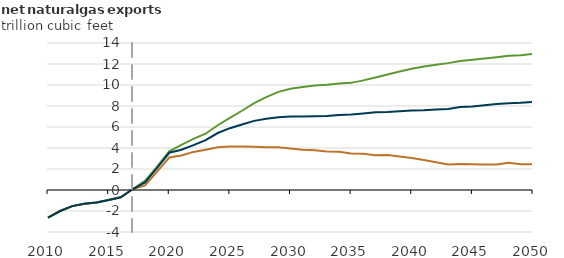
| Category | High oil and gas resource and technology | Low oil and gas resource and technology | Reference |
|---|---|---|---|
| 2010.0 | -2.635 | -2.635 | -2.635 |
| 2011.0 | -2.003 | -2.003 | -2.003 |
| 2012.0 | -1.534 | -1.534 | -1.534 |
| 2013.0 | -1.314 | -1.314 | -1.314 |
| 2014.0 | -1.184 | -1.184 | -1.184 |
| 2015.0 | -0.946 | -0.946 | -0.946 |
| 2016.0 | -0.691 | -0.691 | -0.691 |
| 2017.0 | 0.091 | 0.091 | 0.091 |
| 2018.0 | 0.876 | 0.44 | 0.726 |
| 2019.0 | 2.225 | 1.755 | 2.096 |
| 2020.0 | 3.681 | 3.097 | 3.547 |
| 2021.0 | 4.306 | 3.282 | 3.834 |
| 2022.0 | 4.862 | 3.628 | 4.273 |
| 2023.0 | 5.358 | 3.839 | 4.755 |
| 2024.0 | 6.165 | 4.072 | 5.427 |
| 2025.0 | 6.866 | 4.146 | 5.887 |
| 2026.0 | 7.546 | 4.153 | 6.245 |
| 2027.0 | 8.275 | 4.11 | 6.585 |
| 2028.0 | 8.854 | 4.076 | 6.794 |
| 2029.0 | 9.343 | 4.071 | 6.93 |
| 2030.0 | 9.645 | 3.942 | 6.993 |
| 2031.0 | 9.811 | 3.83 | 7.01 |
| 2032.0 | 9.954 | 3.787 | 7.033 |
| 2033.0 | 10.019 | 3.666 | 7.056 |
| 2034.0 | 10.144 | 3.639 | 7.142 |
| 2035.0 | 10.204 | 3.481 | 7.192 |
| 2036.0 | 10.442 | 3.442 | 7.289 |
| 2037.0 | 10.71 | 3.31 | 7.398 |
| 2038.0 | 10.994 | 3.327 | 7.429 |
| 2039.0 | 11.28 | 3.197 | 7.494 |
| 2040.0 | 11.539 | 3.057 | 7.571 |
| 2041.0 | 11.758 | 2.863 | 7.597 |
| 2042.0 | 11.928 | 2.64 | 7.66 |
| 2043.0 | 12.083 | 2.436 | 7.722 |
| 2044.0 | 12.277 | 2.486 | 7.905 |
| 2045.0 | 12.395 | 2.45 | 7.955 |
| 2046.0 | 12.517 | 2.419 | 8.068 |
| 2047.0 | 12.637 | 2.429 | 8.184 |
| 2048.0 | 12.781 | 2.592 | 8.269 |
| 2049.0 | 12.838 | 2.459 | 8.31 |
| 2050.0 | 12.97 | 2.452 | 8.397 |